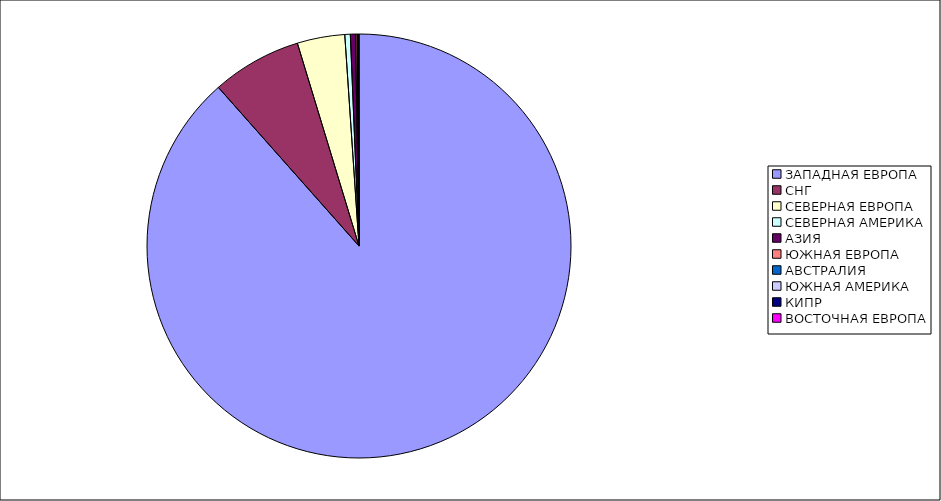
| Category | Оборот |
|---|---|
| ЗАПАДНАЯ ЕВРОПА | 0.885 |
| СНГ | 0.069 |
| СЕВЕРНАЯ ЕВРОПА | 0.036 |
| СЕВЕРНАЯ АМЕРИКА | 0.004 |
| АЗИЯ | 0.004 |
| ЮЖНАЯ ЕВРОПА | 0.001 |
| АВСТРАЛИЯ | 0.001 |
| ЮЖНАЯ АМЕРИКА | 0 |
| КИПР | 0 |
| ВОСТОЧНАЯ ЕВРОПА | 0 |